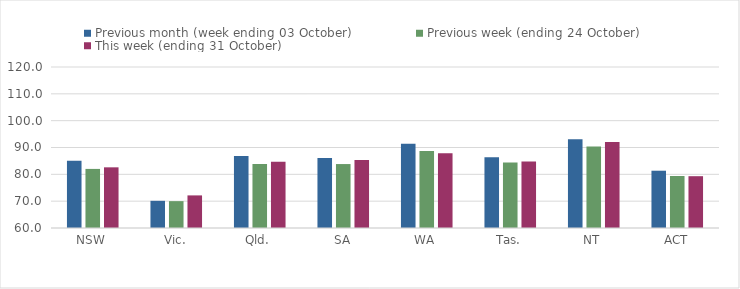
| Category | Previous month (week ending 03 October) | Previous week (ending 24 October) | This week (ending 31 October) |
|---|---|---|---|
| NSW | 85.04 | 82.02 | 82.61 |
| Vic. | 70.13 | 70.01 | 72.15 |
| Qld. | 86.81 | 83.87 | 84.67 |
| SA | 86.07 | 83.83 | 85.31 |
| WA | 91.39 | 88.72 | 87.9 |
| Tas. | 86.35 | 84.38 | 84.74 |
| NT | 93.04 | 90.35 | 92.07 |
| ACT | 81.35 | 79.37 | 79.31 |